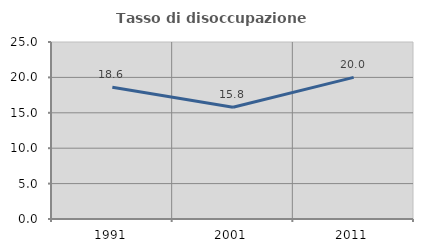
| Category | Tasso di disoccupazione giovanile  |
|---|---|
| 1991.0 | 18.605 |
| 2001.0 | 15.789 |
| 2011.0 | 20 |